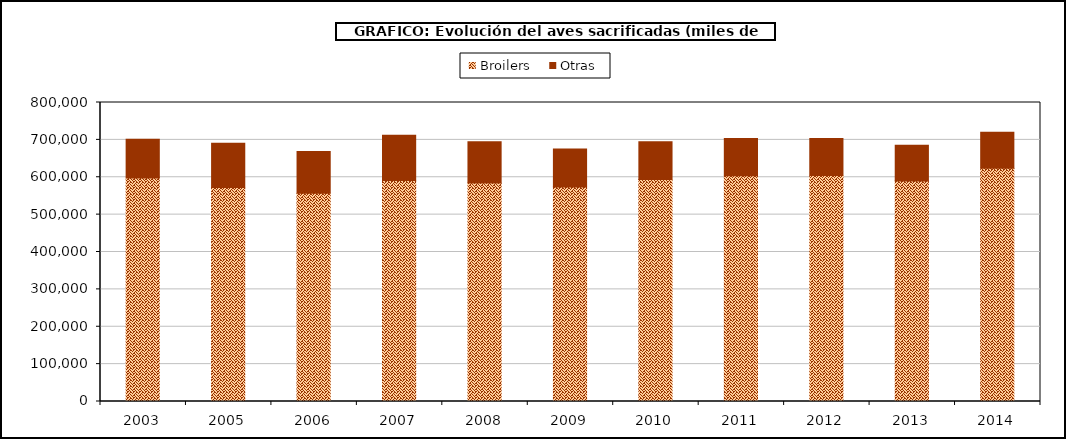
| Category | Broilers | Otras |
|---|---|---|
| 2003.0 | 597829.477 | 103757.125 |
| 2005.0 | 572648.744 | 118205.781 |
| 2006.0 | 556861.129 | 112149.283 |
| 2007.0 | 591393.726 | 120913.02 |
| 2008.0 | 584815.145 | 110075.473 |
| 2009.0 | 573771.704 | 101674.561 |
| 2010.0 | 594157.627 | 100908.152 |
| 2011.0 | 603746.997 | 99980.393 |
| 2012.0 | 604962.301 | 98903.042 |
| 2013.0 | 589666.337 | 95872.2 |
| 2014.0 | 624364.078 | 95729.779 |